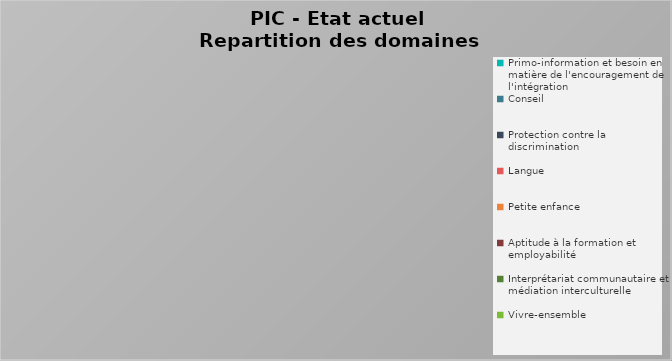
| Category | Total |
|---|---|
| Primo-information et besoin en matière de l'encouragement de l'intégration | 0 |
| Conseil | 0 |
| Protection contre la discrimination | 0 |
| Langue | 0 |
| Petite enfance | 0 |
| Aptitude à la formation et employabilité | 0 |
| Interprétariat communautaire et médiation interculturelle | 0 |
| Vivre-ensemble | 0 |